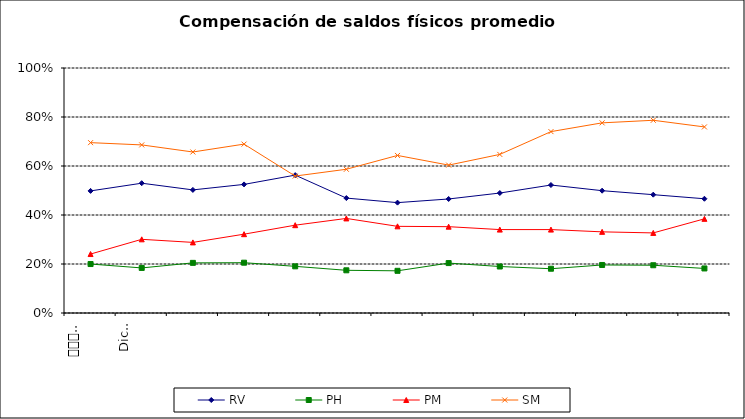
| Category | RV | PH | PM | SM |
|---|---|---|---|---|
| 0 | 0.498 | 0.2 | 0.241 | 0.695 |
| 1 | 0.53 | 0.184 | 0.301 | 0.686 |
| 2 | 0.502 | 0.205 | 0.288 | 0.657 |
| 3 | 0.525 | 0.205 | 0.322 | 0.689 |
| 4 | 0.563 | 0.19 | 0.358 | 0.559 |
| 5 | 0.469 | 0.174 | 0.386 | 0.587 |
| 6 | 0.45 | 0.172 | 0.354 | 0.643 |
| 7 | 0.465 | 0.204 | 0.352 | 0.604 |
| 8 | 0.49 | 0.19 | 0.34 | 0.647 |
| 9 | 0.522 | 0.181 | 0.34 | 0.74 |
| 10 | 0.499 | 0.196 | 0.331 | 0.776 |
| 11 | 0.483 | 0.195 | 0.327 | 0.787 |
| 12 | 0.466 | 0.182 | 0.384 | 0.759 |